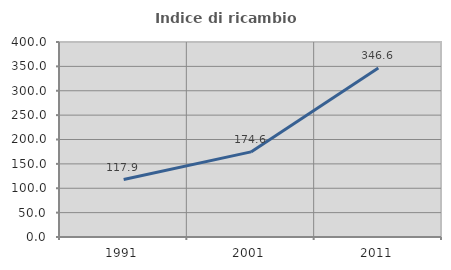
| Category | Indice di ricambio occupazionale  |
|---|---|
| 1991.0 | 117.932 |
| 2001.0 | 174.578 |
| 2011.0 | 346.593 |